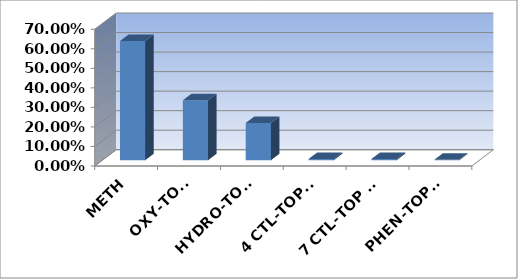
| Category | Series 0 |
|---|---|
| METH | 0.61 |
| OXY-TOP3 | 0.307 |
| HYDRO-TOP3 | 0.191 |
| 4 CTL-TOP 5 | 0.007 |
| 7 CTL-TOP 10 | 0.007 |
| PHEN-TOP25 | 0.002 |